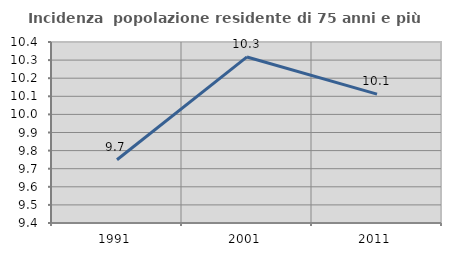
| Category | Incidenza  popolazione residente di 75 anni e più |
|---|---|
| 1991.0 | 9.749 |
| 2001.0 | 10.317 |
| 2011.0 | 10.112 |